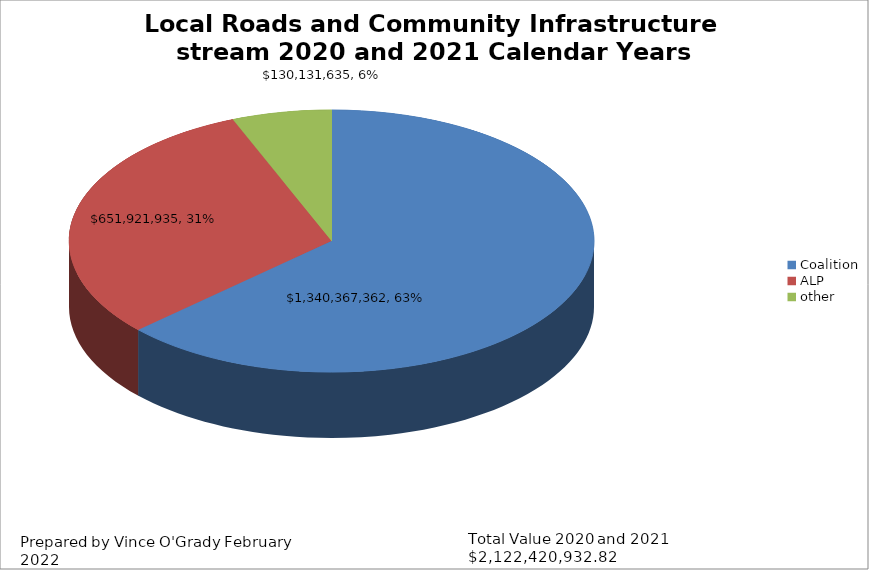
| Category | Local Roads and Community Infrastructure stream 2020 and 2021 Calendar Years |
|---|---|
| Coalition | 1340367361.73 |
| ALP | 651921934.73 |
| other | 130131635.36 |